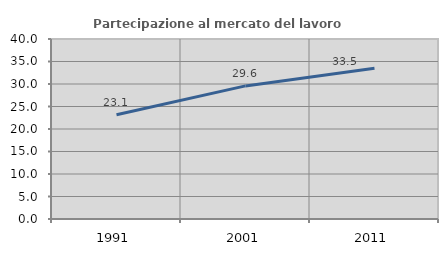
| Category | Partecipazione al mercato del lavoro  femminile |
|---|---|
| 1991.0 | 23.148 |
| 2001.0 | 29.577 |
| 2011.0 | 33.488 |